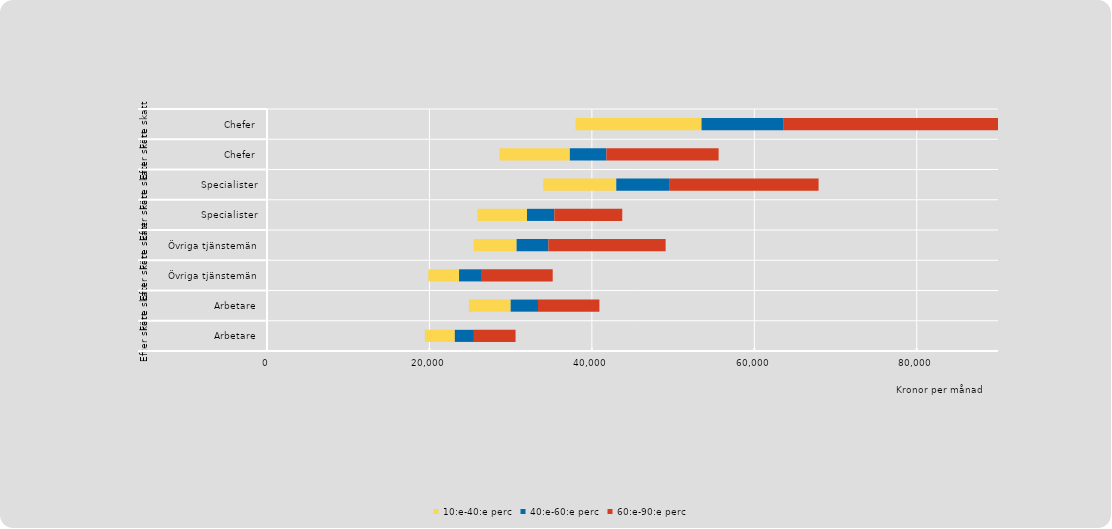
| Category | Series 0 | 10:e-40:e perc | 40:e-60:e perc | 60:e-90:e perc |
|---|---|---|---|---|
| 0 | 19442 | 3680 | 2356 | 5125 |
| 1 | 24863 | 5137 | 3362 | 7564 |
| 2 | 19857 | 3787 | 2703 | 8829 |
| 3 | 25442 | 5288 | 3915 | 14433 |
| 4 | 25910 | 6101 | 3366 | 8363 |
| 5 | 34000 | 9003 | 6497 | 18409 |
| 6 | 28621 | 8666 | 4500 | 13815 |
| 7 | 38000 | 15500 | 10045 | 30866 |